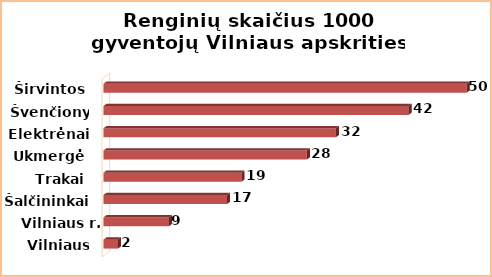
| Category | Series 0 |
|---|---|
| Vilniaus m. | 2 |
| Vilniaus r. | 9 |
| Šalčininkai | 17 |
| Trakai | 19 |
| Ukmergė | 28 |
| Elektrėnai | 32 |
| Švenčionys | 42 |
| Širvintos | 50 |